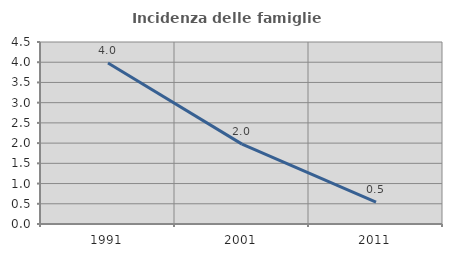
| Category | Incidenza delle famiglie numerose |
|---|---|
| 1991.0 | 3.979 |
| 2001.0 | 1.976 |
| 2011.0 | 0.541 |